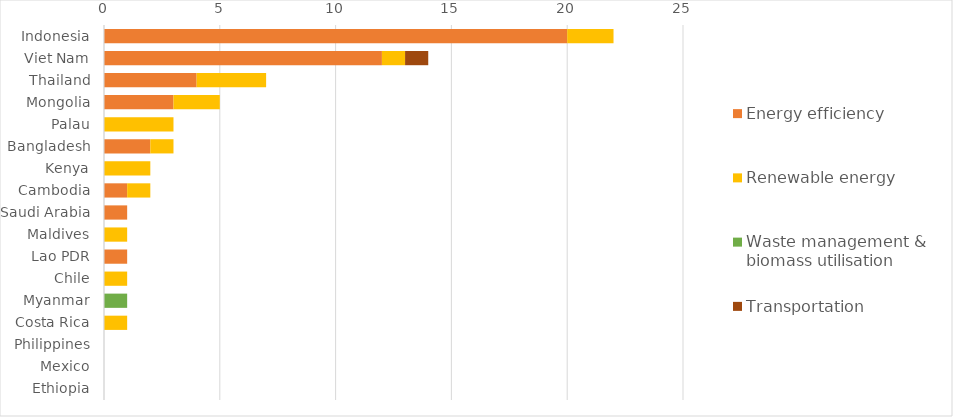
| Category | Energy efficiency | Renewable energy | Waste management & biomass utilisation | Transportation |
|---|---|---|---|---|
| Indonesia | 20 | 2 | 0 | 0 |
| Viet Nam | 12 | 1 | 0 | 1 |
| Thailand | 4 | 3 | 0 | 0 |
| Mongolia | 3 | 2 | 0 | 0 |
| Palau | 0 | 3 | 0 | 0 |
| Bangladesh | 2 | 1 | 0 | 0 |
| Kenya | 0 | 2 | 0 | 0 |
| Cambodia | 1 | 1 | 0 | 0 |
| Saudi Arabia | 1 | 0 | 0 | 0 |
| Maldives | 0 | 1 | 0 | 0 |
| Lao PDR | 1 | 0 | 0 | 0 |
| Chile | 0 | 1 | 0 | 0 |
| Myanmar | 0 | 0 | 1 | 0 |
| Costa Rica | 0 | 1 | 0 | 0 |
| Philippines | 0 | 0 | 0 | 0 |
| Mexico | 0 | 0 | 0 | 0 |
| Ethiopia | 0 | 0 | 0 | 0 |